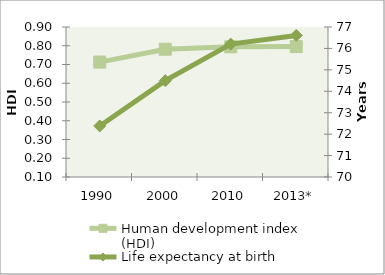
| Category | Human development index (HDI) |
|---|---|
| 1990 | 0.713 |
| 2000 | 0.781 |
| 2010 | 0.794 |
| 2013* | 0.796 |